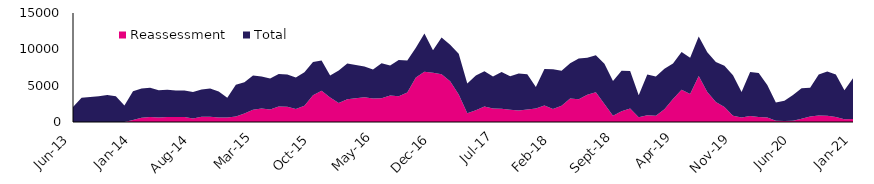
| Category | Reassessment | Total |
|---|---|---|
| 2013-06-01 | 0 | 2073 |
| 2013-07-01 | 6 | 3343 |
| 2013-08-01 | 6 | 3441 |
| 2013-09-01 | 13 | 3531 |
| 2013-10-01 | 12 | 3711 |
| 2013-11-01 | 11 | 3530 |
| 2013-12-01 | 6 | 2262 |
| 2014-01-01 | 288 | 3928 |
| 2014-02-01 | 578 | 4037 |
| 2014-03-01 | 700 | 4003 |
| 2014-04-01 | 612 | 3757 |
| 2014-05-01 | 691 | 3747 |
| 2014-06-01 | 689 | 3636 |
| 2014-07-01 | 686 | 3642 |
| 2014-08-01 | 470 | 3647 |
| 2014-09-01 | 714 | 3769 |
| 2014-10-01 | 725 | 3879 |
| 2014-11-01 | 636 | 3557 |
| 2014-12-01 | 629 | 2701 |
| 2015-01-01 | 761 | 4373 |
| 2015-02-01 | 1156 | 4328 |
| 2015-03-01 | 1698 | 4684 |
| 2015-04-01 | 1844 | 4406 |
| 2015-05-01 | 1731 | 4244 |
| 2015-06-01 | 2117 | 4485 |
| 2015-07-01 | 2084 | 4441 |
| 2015-08-01 | 1782 | 4335 |
| 2015-09-01 | 2235 | 4620 |
| 2015-10-01 | 3679 | 4593 |
| 2015-11-01 | 4295 | 4176 |
| 2015-12-01 | 3383 | 3030 |
| 2016-01-01 | 2629 | 4444 |
| 2016-02-01 | 3147 | 4897 |
| 2016-03-01 | 3280 | 4567 |
| 2016-04-01 | 3415 | 4234 |
| 2016-05-01 | 3250 | 3958 |
| 2016-06-01 | 3263 | 4826 |
| 2016-07-01 | 3632 | 4148 |
| 2016-08-01 | 3547 | 5000 |
| 2016-09-01 | 4062 | 4389 |
| 2016-10-01 | 6139 | 4066 |
| 2016-11-01 | 6921 | 5269 |
| 2016-12-01 | 6761 | 3107 |
| 2017-01-01 | 6572 | 5044 |
| 2017-02-01 | 5616 | 5012 |
| 2017-03-01 | 3776 | 5602 |
| 2017-04-01 | 1211 | 4084 |
| 2017-05-01 | 1614 | 4798 |
| 2017-06-01 | 2146 | 4838 |
| 2017-07-01 | 1872 | 4406 |
| 2017-08-01 | 1810 | 5058 |
| 2017-09-01 | 1672 | 4617 |
| 2017-10-01 | 1596 | 5067 |
| 2017-11-01 | 1709 | 4875 |
| 2017-12-01 | 1848 | 2960 |
| 2018-01-01 | 2270 | 5016 |
| 2018-02-01 | 1789 | 5461 |
| 2018-03-01 | 2252 | 4799 |
| 2018-04-01 | 3220 | 4878 |
| 2018-05-01 | 3128 | 5617 |
| 2018-06-01 | 3760 | 5071 |
| 2018-07-01 | 4080 | 5090 |
| 2018-08-01 | 2477 | 5523 |
| 2018-09-01 | 865 | 4791 |
| 2018-10-01 | 1466 | 5576 |
| 2018-11-01 | 1851 | 5176 |
| 2018-12-01 | 648 | 3031 |
| 2019-01-01 | 917 | 5614 |
| 2019-02-01 | 862 | 5398 |
| 2019-03-01 | 1764 | 5552 |
| 2019-04-01 | 3158 | 4904 |
| 2019-05-01 | 4425 | 5215 |
| 2019-06-01 | 3854 | 4984 |
| 2019-07-01 | 6326 | 5424 |
| 2019-08-01 | 4129 | 5478 |
| 2019-09-01 | 2769 | 5472 |
| 2019-10-01 | 2075 | 5652 |
| 2019-11-01 | 876 | 5569 |
| 2019-12-01 | 614 | 3528 |
| 2020-01-01 | 836 | 6037 |
| 2020-02-01 | 700 | 6035 |
| 2020-03-01 | 607 | 4468 |
| 2020-04-01 | 171 | 2525 |
| 2020-05-01 | 145 | 2781 |
| 2020-06-01 | 159 | 3561 |
| 2020-07-01 | 432 | 4221 |
| 2020-08-01 | 748 | 3982 |
| 2020-09-01 | 884 | 5653 |
| 2020-10-01 | 862 | 6077 |
| 2020-11-01 | 688 | 5838 |
| 2020-12-01 | 390 | 3982 |
| 2021-01-01 | 408 | 5597 |